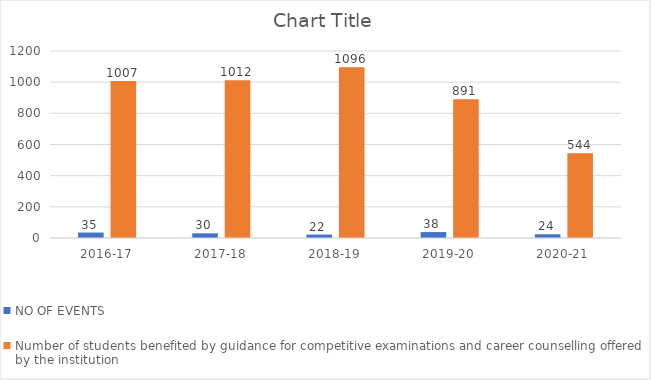
| Category | NO OF EVENTS | Number of students benefited by guidance for competitive examinations and career counselling offered by the institution |
|---|---|---|
| 2016-17 | 35 | 1007 |
| 2017-18 | 30 | 1012 |
| 2018-19 | 22 | 1096 |
| 2019-20 | 38 | 891 |
| 2020-21 | 24 | 544 |